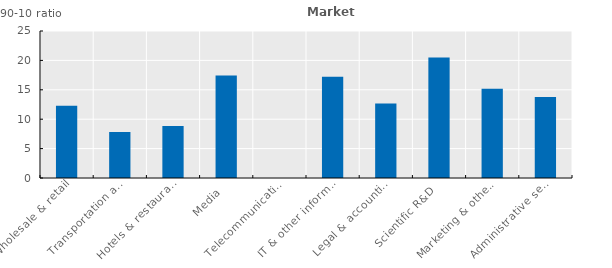
| Category | Series 0 |
|---|---|
| Wholesale & retail | 12.291 |
| Transportation and storage | 7.823 |
| Hotels & restaurants | 8.857 |
| Media  | 17.453 |
| Telecommunications  | 0 |
| IT & other information serv. | 17.215 |
| Legal & accounting | 12.678 |
| Scientific R&D  | 20.507 |
| Marketing & other  | 15.194 |
| Administrative services  | 13.767 |